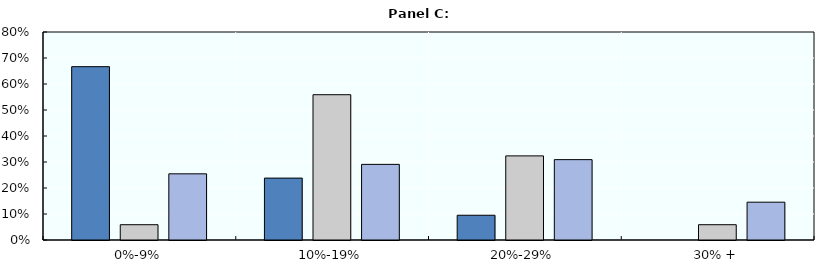
| Category | Series 0 | Series 1 | Series 2 |
|---|---|---|---|
| 0%-9% | 0.667 | 0.059 | 0.255 |
| 10%-19% | 0.238 | 0.559 | 0.291 |
| 20%-29% | 0.095 | 0.324 | 0.309 |
| 30% + | 0 | 0.059 | 0.145 |